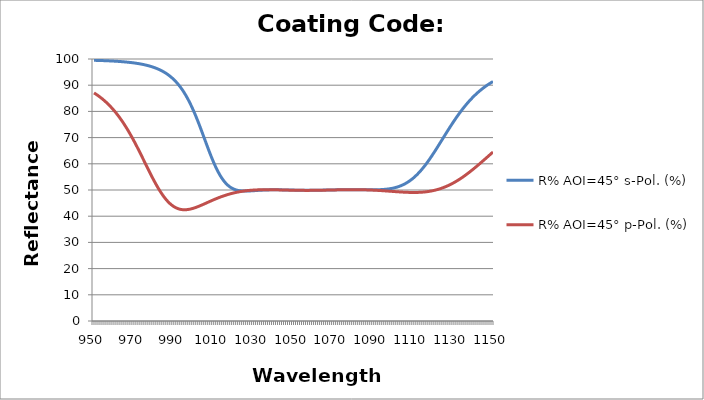
| Category | R% AOI=45° s-Pol. (%) | R% AOI=45° p-Pol. (%) |
|---|---|---|
| 950.0 | 99.496 | 87.051 |
| 951.0 | 99.475 | 86.561 |
| 952.0 | 99.452 | 86.036 |
| 953.0 | 99.428 | 85.476 |
| 954.0 | 99.401 | 84.878 |
| 955.0 | 99.373 | 84.24 |
| 956.0 | 99.342 | 83.561 |
| 957.0 | 99.308 | 82.837 |
| 958.0 | 99.272 | 82.068 |
| 959.0 | 99.233 | 81.251 |
| 960.0 | 99.191 | 80.384 |
| 961.0 | 99.145 | 79.465 |
| 962.0 | 99.095 | 78.494 |
| 963.0 | 99.041 | 77.468 |
| 964.0 | 98.983 | 76.387 |
| 965.0 | 98.919 | 75.251 |
| 966.0 | 98.849 | 74.059 |
| 967.0 | 98.774 | 72.812 |
| 968.0 | 98.691 | 71.513 |
| 969.0 | 98.601 | 70.162 |
| 970.0 | 98.502 | 68.764 |
| 971.0 | 98.394 | 67.323 |
| 972.0 | 98.276 | 65.844 |
| 973.0 | 98.146 | 64.335 |
| 974.0 | 98.004 | 62.802 |
| 975.0 | 97.848 | 61.255 |
| 976.0 | 97.676 | 59.703 |
| 977.0 | 97.486 | 58.159 |
| 978.0 | 97.278 | 56.632 |
| 979.0 | 97.047 | 55.136 |
| 980.0 | 96.793 | 53.683 |
| 981.0 | 96.512 | 52.285 |
| 982.0 | 96.202 | 50.953 |
| 983.0 | 95.858 | 49.698 |
| 984.0 | 95.478 | 48.53 |
| 985.0 | 95.057 | 47.458 |
| 986.0 | 94.59 | 46.486 |
| 987.0 | 94.072 | 45.621 |
| 988.0 | 93.499 | 44.864 |
| 989.0 | 92.865 | 44.216 |
| 990.0 | 92.162 | 43.677 |
| 991.0 | 91.385 | 43.243 |
| 992.0 | 90.528 | 42.911 |
| 993.0 | 89.582 | 42.674 |
| 994.0 | 88.542 | 42.526 |
| 995.0 | 87.402 | 42.46 |
| 996.0 | 86.157 | 42.467 |
| 997.0 | 84.801 | 42.541 |
| 998.0 | 83.334 | 42.672 |
| 999.0 | 81.754 | 42.854 |
| 1000.0 | 80.066 | 43.077 |
| 1001.0 | 78.274 | 43.336 |
| 1002.0 | 76.39 | 43.622 |
| 1003.0 | 74.428 | 43.93 |
| 1004.0 | 72.408 | 44.254 |
| 1005.0 | 70.351 | 44.589 |
| 1006.0 | 68.284 | 44.93 |
| 1007.0 | 66.235 | 45.273 |
| 1008.0 | 64.235 | 45.614 |
| 1009.0 | 62.31 | 45.952 |
| 1010.0 | 60.49 | 46.282 |
| 1011.0 | 58.794 | 46.602 |
| 1012.0 | 57.242 | 46.912 |
| 1013.0 | 55.846 | 47.209 |
| 1014.0 | 54.613 | 47.492 |
| 1015.0 | 53.542 | 47.761 |
| 1016.0 | 52.63 | 48.015 |
| 1017.0 | 51.868 | 48.252 |
| 1018.0 | 51.246 | 48.474 |
| 1019.0 | 50.75 | 48.68 |
| 1020.0 | 50.364 | 48.87 |
| 1021.0 | 50.074 | 49.044 |
| 1022.0 | 49.866 | 49.202 |
| 1023.0 | 49.726 | 49.346 |
| 1024.0 | 49.64 | 49.475 |
| 1025.0 | 49.598 | 49.59 |
| 1026.0 | 49.589 | 49.691 |
| 1027.0 | 49.605 | 49.779 |
| 1028.0 | 49.638 | 49.855 |
| 1029.0 | 49.683 | 49.919 |
| 1030.0 | 49.734 | 49.973 |
| 1031.0 | 49.788 | 50.017 |
| 1032.0 | 49.841 | 50.051 |
| 1033.0 | 49.892 | 50.077 |
| 1034.0 | 49.936 | 50.095 |
| 1035.0 | 49.974 | 50.107 |
| 1036.0 | 50.005 | 50.113 |
| 1037.0 | 50.03 | 50.114 |
| 1038.0 | 50.049 | 50.11 |
| 1039.0 | 50.062 | 50.101 |
| 1040.0 | 50.069 | 50.09 |
| 1041.0 | 50.07 | 50.075 |
| 1042.0 | 50.068 | 50.058 |
| 1043.0 | 50.061 | 50.04 |
| 1044.0 | 50.05 | 50.021 |
| 1045.0 | 50.038 | 50.001 |
| 1046.0 | 50.023 | 49.981 |
| 1047.0 | 50.007 | 49.962 |
| 1048.0 | 49.991 | 49.943 |
| 1049.0 | 49.975 | 49.925 |
| 1050.0 | 49.959 | 49.909 |
| 1051.0 | 49.945 | 49.894 |
| 1052.0 | 49.932 | 49.882 |
| 1053.0 | 49.92 | 49.872 |
| 1054.0 | 49.911 | 49.864 |
| 1055.0 | 49.904 | 49.858 |
| 1056.0 | 49.899 | 49.855 |
| 1057.0 | 49.897 | 49.854 |
| 1058.0 | 49.897 | 49.856 |
| 1059.0 | 49.9 | 49.86 |
| 1060.0 | 49.905 | 49.866 |
| 1061.0 | 49.912 | 49.875 |
| 1062.0 | 49.92 | 49.886 |
| 1063.0 | 49.931 | 49.898 |
| 1064.0 | 49.943 | 49.912 |
| 1065.0 | 49.957 | 49.928 |
| 1066.0 | 49.971 | 49.944 |
| 1067.0 | 49.986 | 49.962 |
| 1068.0 | 50.002 | 49.98 |
| 1069.0 | 50.017 | 49.998 |
| 1070.0 | 50.032 | 50.017 |
| 1071.0 | 50.046 | 50.035 |
| 1072.0 | 50.06 | 50.052 |
| 1073.0 | 50.073 | 50.068 |
| 1074.0 | 50.084 | 50.083 |
| 1075.0 | 50.093 | 50.096 |
| 1076.0 | 50.101 | 50.108 |
| 1077.0 | 50.107 | 50.117 |
| 1078.0 | 50.111 | 50.124 |
| 1079.0 | 50.113 | 50.128 |
| 1080.0 | 50.113 | 50.129 |
| 1081.0 | 50.111 | 50.126 |
| 1082.0 | 50.107 | 50.121 |
| 1083.0 | 50.102 | 50.112 |
| 1084.0 | 50.096 | 50.099 |
| 1085.0 | 50.089 | 50.082 |
| 1086.0 | 50.083 | 50.062 |
| 1087.0 | 50.077 | 50.037 |
| 1088.0 | 50.073 | 50.009 |
| 1089.0 | 50.072 | 49.977 |
| 1090.0 | 50.074 | 49.941 |
| 1091.0 | 50.082 | 49.902 |
| 1092.0 | 50.097 | 49.859 |
| 1093.0 | 50.121 | 49.814 |
| 1094.0 | 50.155 | 49.765 |
| 1095.0 | 50.203 | 49.714 |
| 1096.0 | 50.266 | 49.661 |
| 1097.0 | 50.347 | 49.606 |
| 1098.0 | 50.449 | 49.55 |
| 1099.0 | 50.575 | 49.494 |
| 1100.0 | 50.728 | 49.437 |
| 1101.0 | 50.912 | 49.382 |
| 1102.0 | 51.131 | 49.327 |
| 1103.0 | 51.387 | 49.276 |
| 1104.0 | 51.685 | 49.227 |
| 1105.0 | 52.027 | 49.183 |
| 1106.0 | 52.418 | 49.143 |
| 1107.0 | 52.86 | 49.11 |
| 1108.0 | 53.356 | 49.084 |
| 1109.0 | 53.909 | 49.066 |
| 1110.0 | 54.521 | 49.058 |
| 1111.0 | 55.193 | 49.06 |
| 1112.0 | 55.926 | 49.075 |
| 1113.0 | 56.72 | 49.103 |
| 1114.0 | 57.573 | 49.145 |
| 1115.0 | 58.484 | 49.202 |
| 1116.0 | 59.45 | 49.277 |
| 1117.0 | 60.467 | 49.37 |
| 1118.0 | 61.532 | 49.482 |
| 1119.0 | 62.64 | 49.614 |
| 1120.0 | 63.783 | 49.768 |
| 1121.0 | 64.958 | 49.944 |
| 1122.0 | 66.156 | 50.143 |
| 1123.0 | 67.372 | 50.366 |
| 1124.0 | 68.598 | 50.614 |
| 1125.0 | 69.828 | 50.887 |
| 1126.0 | 71.055 | 51.185 |
| 1127.0 | 72.273 | 51.509 |
| 1128.0 | 73.477 | 51.86 |
| 1129.0 | 74.661 | 52.236 |
| 1130.0 | 75.821 | 52.637 |
| 1131.0 | 76.952 | 53.064 |
| 1132.0 | 78.052 | 53.516 |
| 1133.0 | 79.117 | 53.991 |
| 1134.0 | 80.145 | 54.489 |
| 1135.0 | 81.134 | 55.01 |
| 1136.0 | 82.084 | 55.551 |
| 1137.0 | 82.994 | 56.113 |
| 1138.0 | 83.862 | 56.692 |
| 1139.0 | 84.691 | 57.288 |
| 1140.0 | 85.48 | 57.9 |
| 1141.0 | 86.229 | 58.526 |
| 1142.0 | 86.94 | 59.163 |
| 1143.0 | 87.613 | 59.811 |
| 1144.0 | 88.251 | 60.468 |
| 1145.0 | 88.853 | 61.131 |
| 1146.0 | 89.423 | 61.8 |
| 1147.0 | 89.96 | 62.472 |
| 1148.0 | 90.468 | 63.147 |
| 1149.0 | 90.946 | 63.822 |
| 1150.0 | 91.397 | 64.497 |